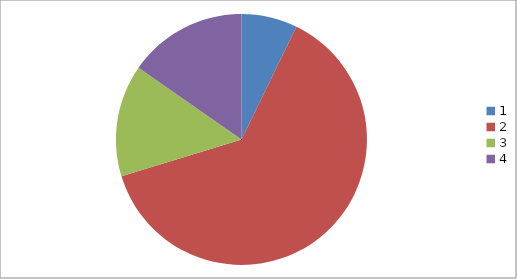
| Category | Series 0 |
|---|---|
| 0 | 0.08 |
| 1 | 0.7 |
| 2 | 0.16 |
| 3 | 0.17 |